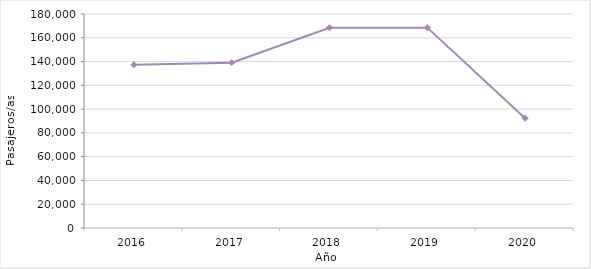
| Category | Series 0 |
|---|---|
| 2016.0 | 137352 |
| 2017.0 | 139024 |
| 2018.0 | 168479 |
| 2019.0 | 168532 |
| 2020.0 | 92231 |